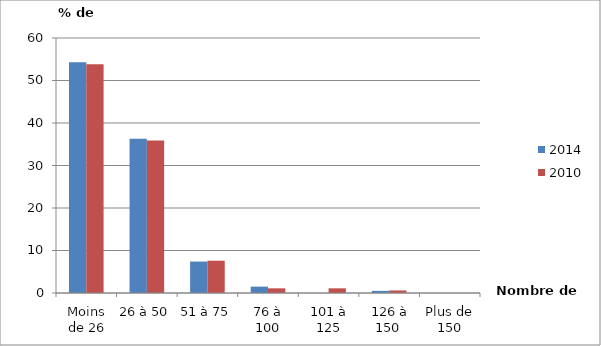
| Category | 2014 | 2010 |
|---|---|---|
| Moins de 26 | 54.3 | 53.8 |
| 26 à 50 | 36.3 | 35.9 |
| 51 à 75 | 7.4 | 7.6 |
| 76 à 100 | 1.5 | 1.1 |
| 101 à 125 | 0 | 1.1 |
| 126 à 150  | 0.5 | 0.6 |
| Plus de 150 | 0 | 0 |